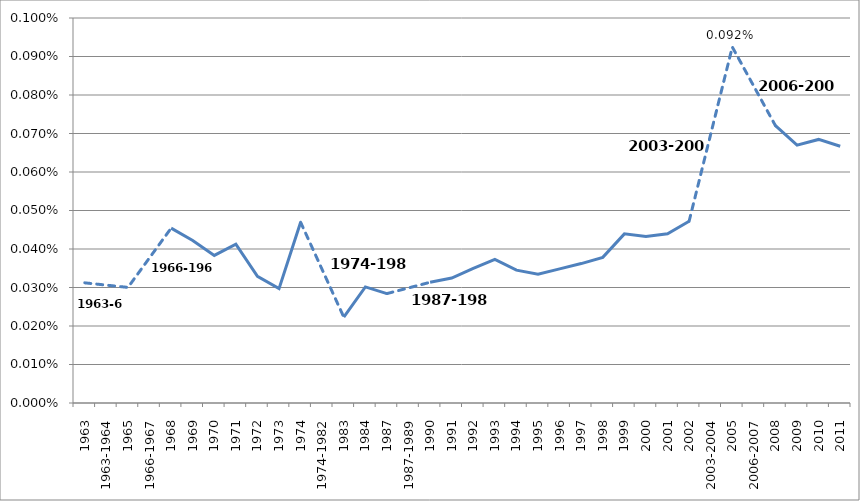
| Category | Series 0 |
|---|---|
| 1963 | 0 |
| 1963-1964 | 0 |
| 1965 | 0 |
| 1966-1967 | 0 |
| 1968 | 0 |
| 1969 | 0 |
| 1970 | 0 |
| 1971 | 0 |
| 1972 | 0 |
| 1973 | 0 |
| 1974 | 0 |
| 1974-1982 | 0 |
| 1983 | 0 |
| 1984 | 0 |
| 1987 | 0 |
| 1987-1989 | 0 |
| 1990 | 0 |
| 1991 | 0 |
| 1992 | 0 |
| 1993 | 0 |
| 1994 | 0 |
| 1995 | 0 |
| 1996 | 0 |
| 1997 | 0 |
| 1998 | 0 |
| 1999 | 0 |
| 2000 | 0 |
| 2001 | 0 |
| 2002 | 0 |
| 2003-2004 | 0.001 |
| 2005 | 0.001 |
| 2006-2007 | 0.001 |
| 2008 | 0.001 |
| 2009 | 0.001 |
| 2010 | 0.001 |
| 2011 | 0.001 |